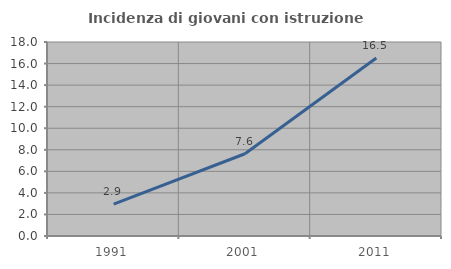
| Category | Incidenza di giovani con istruzione universitaria |
|---|---|
| 1991.0 | 2.949 |
| 2001.0 | 7.629 |
| 2011.0 | 16.517 |